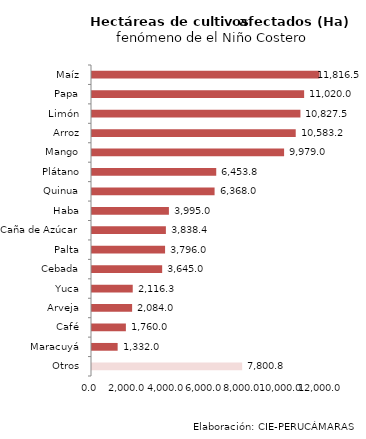
| Category | Series 0 |
|---|---|
| Maíz | 11816.48 |
| Papa | 11020 |
| Limón | 10827.52 |
| Arroz | 10583.19 |
| Mango | 9979 |
| Plátano | 6453.75 |
| Quinua | 6368 |
| Haba | 3995 |
| Caña de Azúcar | 3838.4 |
| Palta | 3796 |
| Cebada | 3645 |
| Yuca | 2116.25 |
| Arveja | 2084 |
| Café | 1760 |
| Maracuyá | 1332 |
| Otros | 7800.75 |